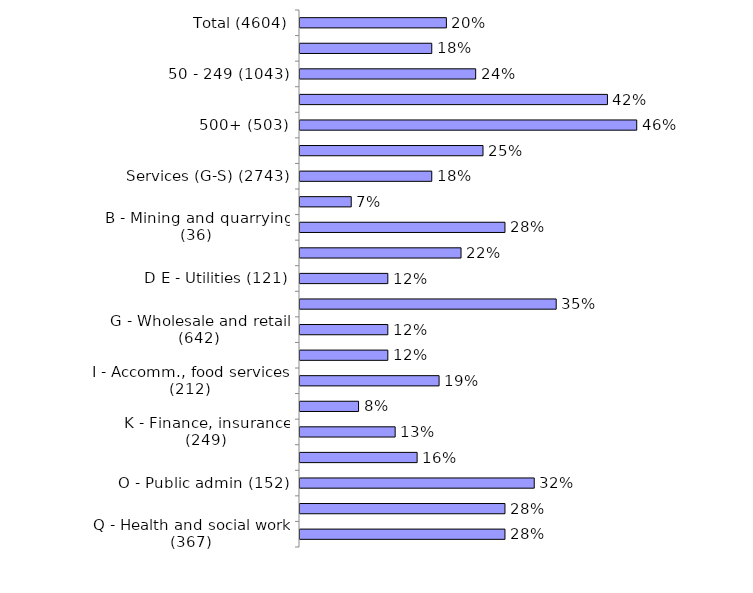
| Category | Series 0 |
|---|---|
| Total (4604) | 0.2 |
| 10-49 (2678) | 0.18 |
| 50 - 249 (1043) | 0.24 |
| 250 - 499 (380) | 0.42 |
| 500+ (503) | 0.46 |
| Production (A-F) (1861) | 0.25 |
| Services (G-S) (2743) | 0.18 |
| A - Agriculture (135) | 0.07 |
| B - Mining and quarrying (36) | 0.28 |
| C - Manufacturing (1396) | 0.22 |
| D E - Utilities (121) | 0.12 |
| F - Construction (173) | 0.35 |
| G - Wholesale and retail (642) | 0.12 |
| H - Transport , storage (203) | 0.12 |
| I - Accomm., food services (212) | 0.19 |
| J - Information, comms (170) | 0.08 |
| K - Finance, insurance (249) | 0.13 |
| LMNRS - Bus/tech/admin/arts/other (366) | 0.16 |
| O - Public admin (152) | 0.32 |
| P - Education (382) | 0.28 |
| Q - Health and social work (367) | 0.28 |